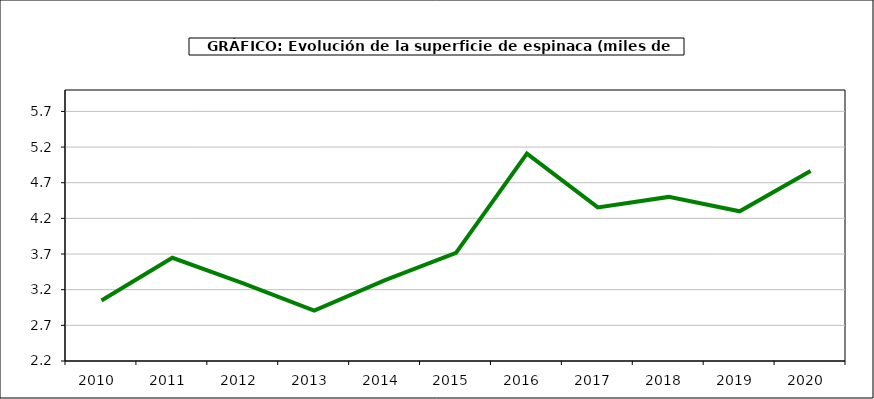
| Category | superficie |
|---|---|
| 2010.0 | 3.049 |
| 2011.0 | 3.647 |
| 2012.0 | 3.289 |
| 2013.0 | 2.908 |
| 2014.0 | 3.335 |
| 2015.0 | 3.717 |
| 2016.0 | 5.108 |
| 2017.0 | 4.353 |
| 2018.0 | 4.501 |
| 2019.0 | 4.299 |
| 2020.0 | 4.864 |